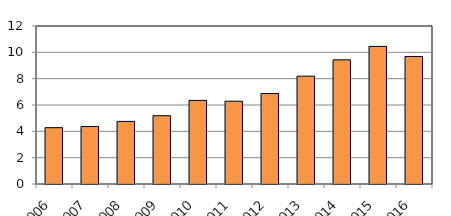
| Category | Series 1 |
|---|---|
| 2006 | 4279 |
| 2007 | 4369 |
| 2008 | 4755 |
| 2009 | 5186 |
| 2010 | 6350 |
| 2011 | 6288 |
| 2012 | 6870 |
| 2013 | 8191 |
| 2014 | 9430 |
| 2015 | 10450 |
| 2016 | 9684 |